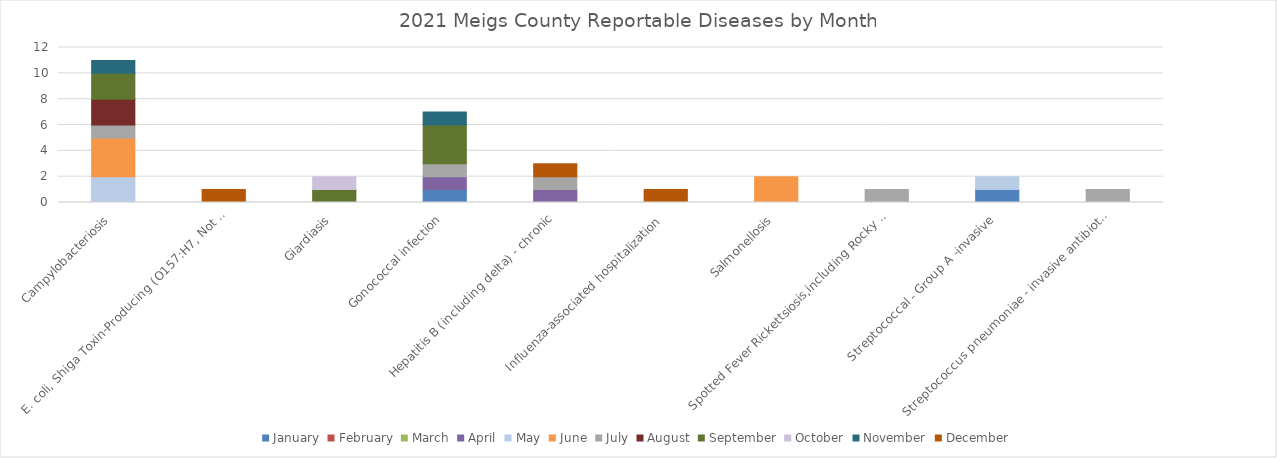
| Category | January | February | March | April | May | June | July | August | September | October | November | December |
|---|---|---|---|---|---|---|---|---|---|---|---|---|
| Campylobacteriosis | 0 | 0 | 0 | 0 | 2 | 3 | 1 | 2 | 2 | 0 | 1 | 0 |
| E. coli, Shiga Toxin-Producing (O157:H7, Not O157, Unknown Serotype) | 0 | 0 | 0 | 0 | 0 | 0 | 0 | 0 | 0 | 0 | 0 | 1 |
| Giardiasis | 0 | 0 | 0 | 0 | 0 | 0 | 0 | 0 | 1 | 1 | 0 | 0 |
| Gonococcal infection | 1 | 0 | 0 | 1 | 0 | 0 | 1 | 0 | 3 | 0 | 1 | 0 |
| Hepatitis B (including delta) - chronic | 0 | 0 | 0 | 1 | 0 | 0 | 1 | 0 | 0 | 0 | 0 | 1 |
| Influenza-associated hospitalization | 0 | 0 | 0 | 0 | 0 | 0 | 0 | 0 | 0 | 0 | 0 | 1 |
| Salmonellosis | 0 | 0 | 0 | 0 | 0 | 2 | 0 | 0 | 0 | 0 | 0 | 0 |
| Spotted Fever Rickettsiosis,including Rocky Mountain spotted fever (RMSF) | 0 | 0 | 0 | 0 | 0 | 0 | 1 | 0 | 0 | 0 | 0 | 0 |
| Streptococcal - Group A -invasive | 1 | 0 | 0 | 0 | 1 | 0 | 0 | 0 | 0 | 0 | 0 | 0 |
| Streptococcus pneumoniae - invasive antibiotic resistant/intermediate | 0 | 0 | 0 | 0 | 0 | 0 | 1 | 0 | 0 | 0 | 0 | 0 |